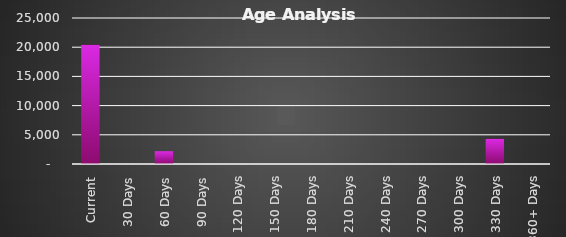
| Category |  Balance  |
|---|---|
| Current | 20430 |
| 30 Days | 0 |
| 60 Days | 2196 |
| 90 Days | 0 |
| 120 Days | 0 |
| 150 Days | 0 |
| 180 Days | 0 |
| 210 Days | 0 |
| 240 Days | 0 |
| 270 Days | 0 |
| 300 Days | 0 |
| 330 Days | 4320 |
| 360+ Days | 0 |